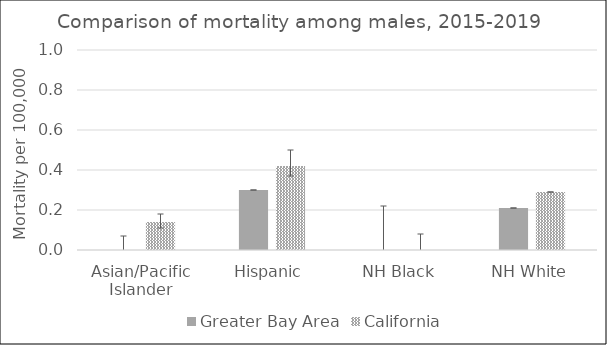
| Category | Greater Bay Area | California | US Mortality |
|---|---|---|---|
| Asian/Pacific Islander | 0 | 0.14 |  |
| Hispanic | 0.3 | 0.42 |  |
| NH Black | 0 | 0 |  |
| NH White | 0.21 | 0.29 |  |